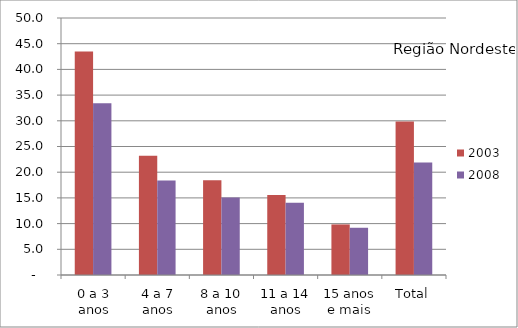
| Category | 2003 | 2008 |
|---|---|---|
| 0 a 3 anos | 43.5 | 33.43 |
| 4 a 7 anos | 23.21 | 18.38 |
| 8 a 10 anos | 18.44 | 15.08 |
| 11 a 14 anos | 15.54 | 14.06 |
| 15 anos e mais | 9.84 | 9.19 |
| Total | 29.87 | 21.88 |